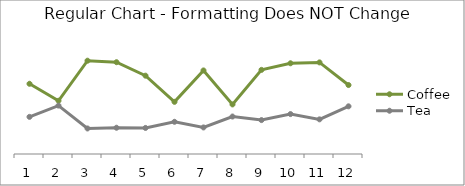
| Category | Coffee | Tea |
|---|---|---|
| 0 | 1439 | 761 |
| 1 | 1091 | 992 |
| 2 | 1912 | 523 |
| 3 | 1881 | 538 |
| 4 | 1605 | 534 |
| 5 | 1069 | 660 |
| 6 | 1712 | 544 |
| 7 | 1016 | 768 |
| 8 | 1724 | 695 |
| 9 | 1859 | 818 |
| 10 | 1877 | 710 |
| 11 | 1413 | 977 |